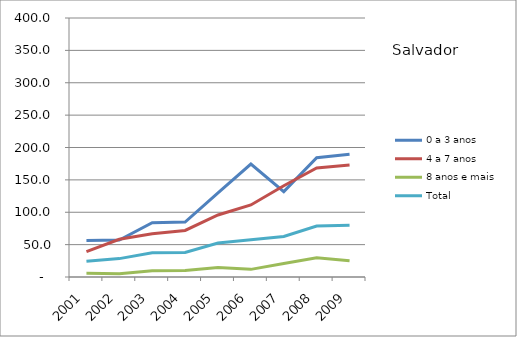
| Category | 0 a 3 anos | 4 a 7 anos | 8 anos e mais | Total |
|---|---|---|---|---|
| 2001.0 | 56.4 | 39.1 | 5.6 | 24.3 |
| 2002.0 | 57.2 | 58.3 | 5.2 | 28.4 |
| 2003.0 | 83.8 | 66.9 | 9.8 | 37.3 |
| 2004.0 | 84.9 | 71.9 | 10.1 | 37.9 |
| 2005.0 | 129.9 | 95.8 | 14.5 | 52.4 |
| 2006.0 | 174.4 | 111.3 | 11.8 | 57.4 |
| 2007.0 | 131.8 | 141 | 20.9 | 62.6 |
| 2008.0 | 184.2 | 168.5 | 29.7 | 78.6 |
| 2009.0 | 189.7 | 172.9 | 25.2 | 79.9 |